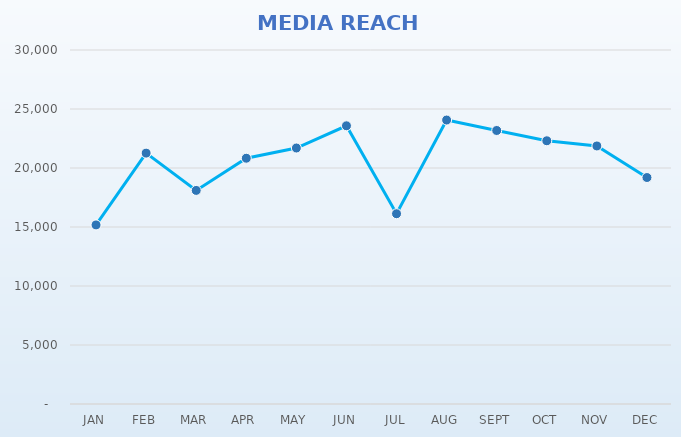
| Category | Series 0 | Series 1 |
|---|---|---|
| JAN |  | 15175 |
| FEB |  | 21262 |
| MAR |  | 18101 |
| APR |  | 20828 |
| MAY |  | 21694 |
| JUN |  | 23577 |
| JUL |  | 16125 |
| AUG |  | 24065 |
| SEPT |  | 23179 |
| OCT |  | 22307 |
| NOV |  | 21867 |
| DEC |  | 19193 |